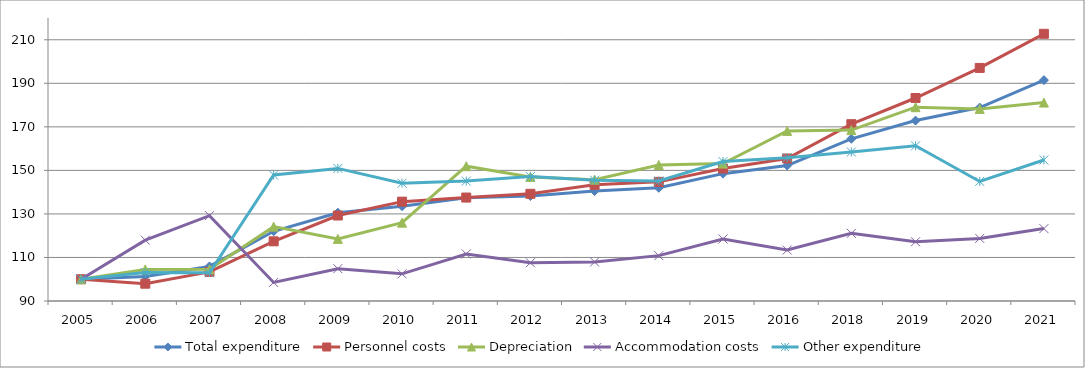
| Category | Total expenditure | Personnel costs | Depreciation | Accommodation costs | Other expenditure |
|---|---|---|---|---|---|
| 2005.0 | 100 | 100 | 100 | 100 | 100 |
| 2006.0 | 101.301 | 97.949 | 104.506 | 117.948 | 103.111 |
| 2007.0 | 105.876 | 103.387 | 104.584 | 129.213 | 102.991 |
| 2008.0 | 122.03 | 117.407 | 124.16 | 98.531 | 147.864 |
| 2009.0 | 130.557 | 129.274 | 118.537 | 104.856 | 150.913 |
| 2010.0 | 133.535 | 135.64 | 125.999 | 102.477 | 144.12 |
| 2011.0 | 137.387 | 137.525 | 151.917 | 111.609 | 145.079 |
| 2012.0 | 138.226 | 139.248 | 147.003 | 107.587 | 147.164 |
| 2013.0 | 140.495 | 143.356 | 145.723 | 107.943 | 145.466 |
| 2014.0 | 142 | 144.734 | 152.46 | 110.841 | 145.114 |
| 2015.0 | 148.497 | 150.859 | 153.115 | 118.473 | 154.039 |
| 2016.0 | 152.229 | 155.452 | 168.123 | 113.419 | 155.827 |
| 2018.0 | 164.501 | 171.221 | 168.495 | 121.086 | 158.442 |
| 2019.0 | 172.878 | 183.247 | 179.033 | 117.22 | 161.294 |
| 2020.0 | 178.854 | 197.066 | 178.239 | 118.759 | 144.921 |
| 2021.0 | 191.464 | 212.737 | 181.15 | 123.258 | 154.774 |